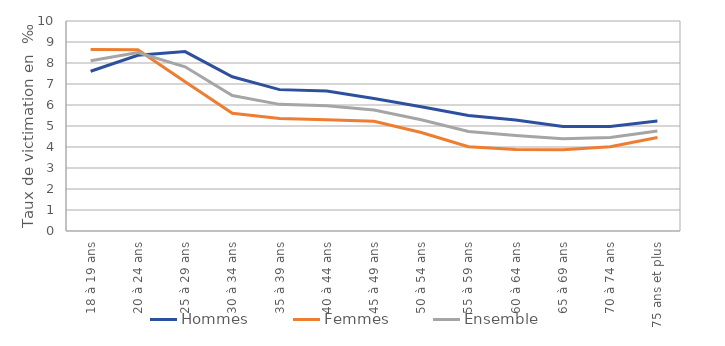
| Category | Hommes | Femmes | Ensemble |
|---|---|---|---|
| 18 à 19 ans | 7.605 | 8.648 | 8.111 |
| 20 à 24 ans | 8.367 | 8.635 | 8.499 |
| 25 à 29 ans | 8.544 | 7.109 | 7.82 |
| 30 à 34 ans | 7.343 | 5.607 | 6.452 |
| 35 à 39 ans | 6.732 | 5.36 | 6.03 |
| 40 à 44 ans | 6.661 | 5.297 | 5.97 |
| 45 à 49 ans | 6.307 | 5.228 | 5.763 |
| 50 à 54 ans | 5.913 | 4.693 | 5.294 |
| 55 à 59 ans | 5.505 | 4.013 | 4.739 |
| 60 à 64 ans | 5.282 | 3.886 | 4.552 |
| 65 à 69 ans | 4.977 | 3.863 | 4.388 |
| 70 à 74 ans | 4.977 | 4.007 | 4.456 |
| 75 ans et plus | 5.238 | 4.453 | 4.758 |